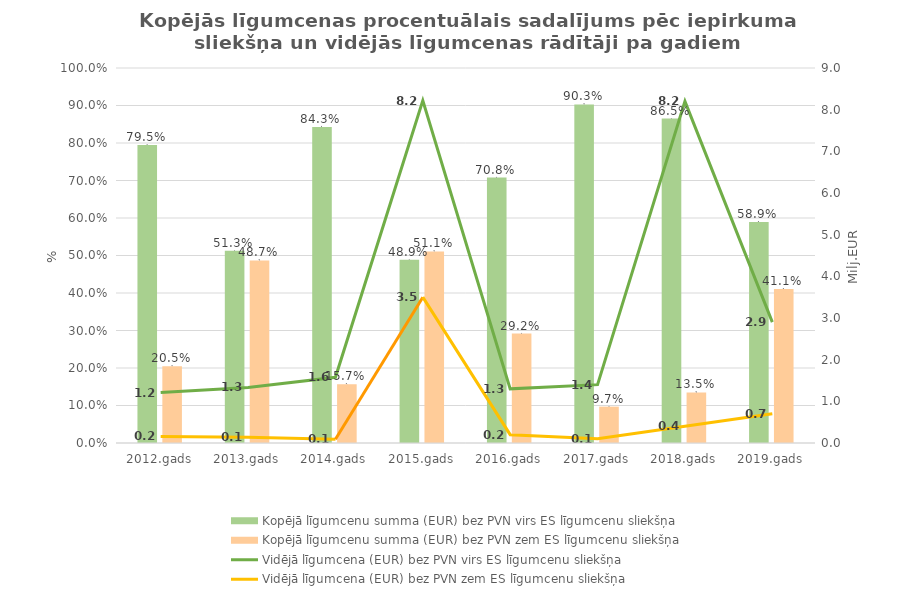
| Category | Kopējā līgumcenu summa (EUR) bez PVN |
|---|---|
| 2012.gads | 0.205 |
| 2013.gads | 0.487 |
| 2014.gads | 0.157 |
| 2015.gads | 0.511 |
| 2016.gads | 0.292 |
| 2017.gads | 0.097 |
| 2018.gads | 0.135 |
| 2019.gads | 0.411 |